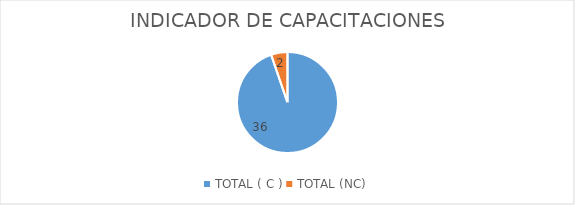
| Category | Series 0 |
|---|---|
| TOTAL ( C ) | 36 |
| TOTAL (NC) | 2 |